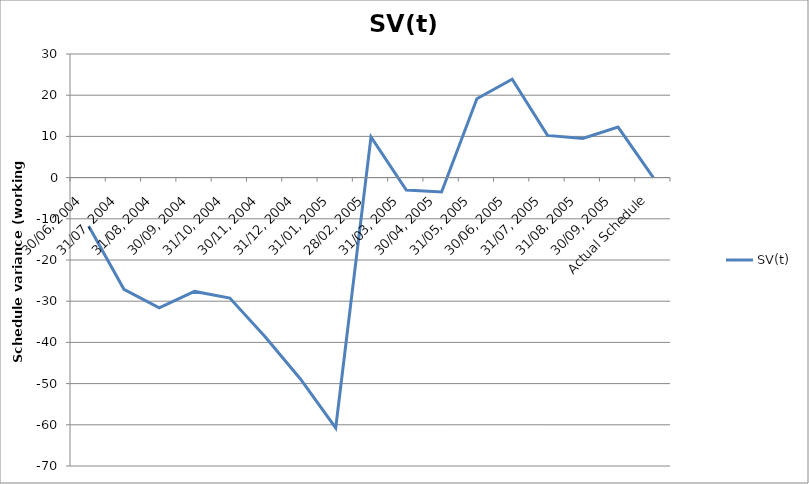
| Category | SV(t) |
|---|---|
| 30/06, 2004 | -11.75 |
| 31/07, 2004 | -27.125 |
| 31/08, 2004 | -31.625 |
| 30/09, 2004 | -27.625 |
| 31/10, 2004 | -29.25 |
| 30/11, 2004 | -38.625 |
| 31/12, 2004 | -48.875 |
| 31/01, 2005 | -60.75 |
| 28/02, 2005 | 9.875 |
| 31/03, 2005 | -3 |
| 30/04, 2005 | -3.5 |
| 31/05, 2005 | 19.125 |
| 30/06, 2005 | 23.875 |
| 31/07, 2005 | 10.25 |
| 31/08, 2005 | 9.5 |
| 30/09, 2005 | 12.25 |
| Actual Schedule | 0 |